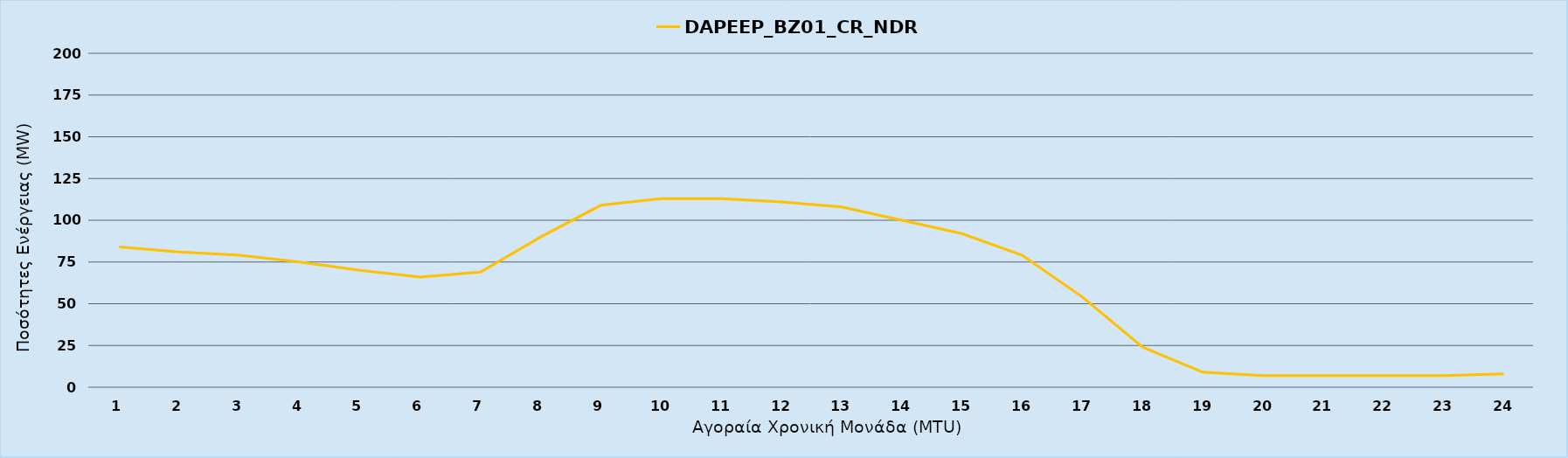
| Category | DAPEEP_BZ01_CR_NDR |
|---|---|
| 0 | 84 |
| 1 | 81 |
| 2 | 79 |
| 3 | 75 |
| 4 | 70 |
| 5 | 66 |
| 6 | 69 |
| 7 | 90 |
| 8 | 109 |
| 9 | 113 |
| 10 | 113 |
| 11 | 111 |
| 12 | 108 |
| 13 | 100 |
| 14 | 92 |
| 15 | 79 |
| 16 | 54 |
| 17 | 24 |
| 18 | 9 |
| 19 | 7 |
| 20 | 7 |
| 21 | 7 |
| 22 | 7 |
| 23 | 8 |